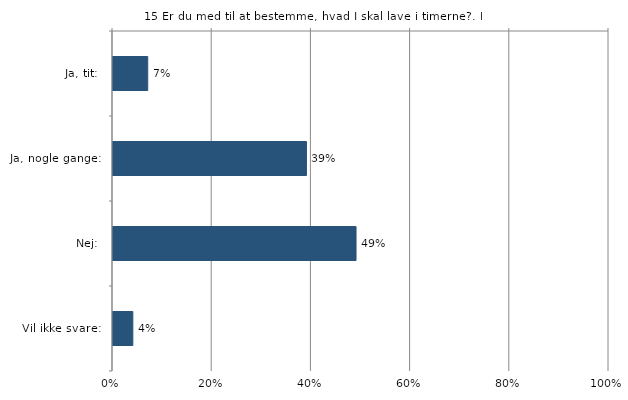
| Category | Er du med til at bestemme, hvad I skal lave i timerne? |
|---|---|
| Ja, tit:  | 0.07 |
| Ja, nogle gange:  | 0.39 |
| Nej:  | 0.49 |
| Vil ikke svare:  | 0.04 |